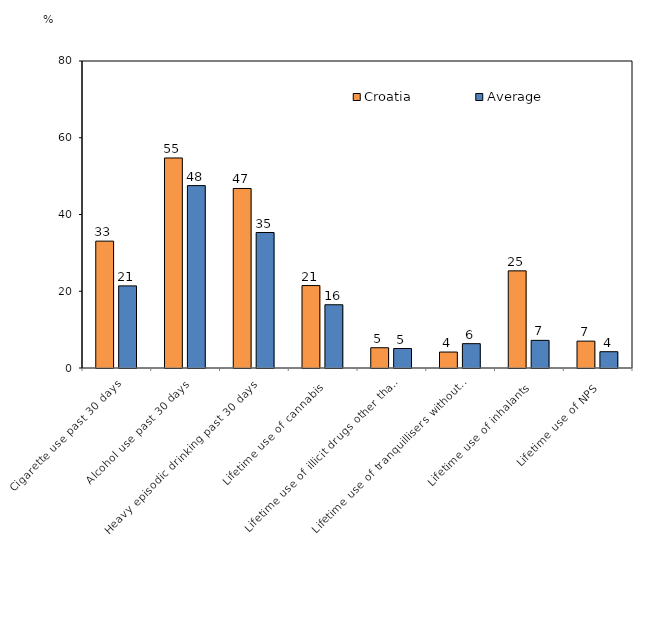
| Category | Croatia | Average |
|---|---|---|
| Cigarette use past 30 days | 33.06 | 21.397 |
| Alcohol use past 30 days | 54.73 | 47.531 |
| Heavy episodic drinking past 30 days | 46.78 | 35.309 |
| Lifetime use of cannabis | 21.48 | 16.48 |
| Lifetime use of illicit drugs other than cannabis | 5.28 | 5.079 |
| Lifetime use of tranquillisers without prescription  | 4.16 | 6.34 |
| Lifetime use of inhalants | 25.31 | 7.202 |
| Lifetime use of NPS | 7 | 4.246 |